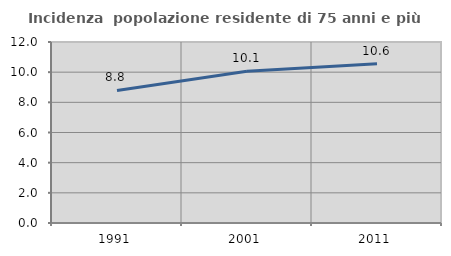
| Category | Incidenza  popolazione residente di 75 anni e più |
|---|---|
| 1991.0 | 8.787 |
| 2001.0 | 10.067 |
| 2011.0 | 10.56 |